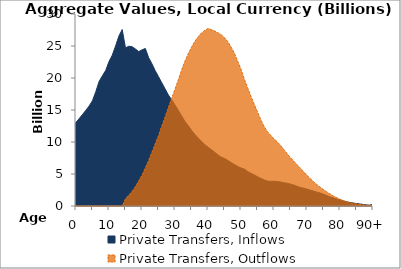
| Category | Private Transfers, Inflows | Private Transfers, Outflows |
|---|---|---|
| 0 | 13060.949 | 0 |
|  | 13683.931 | 0 |
| 2 | 14319.174 | 0 |
| 3 | 14969.134 | 0 |
| 4 | 15635.68 | 0 |
| 5 | 16471.682 | 0 |
| 6 | 17861.365 | 0 |
| 7 | 19458.074 | 0 |
| 8 | 20355.669 | 0 |
| 9 | 21187.214 | 0 |
| 10 | 22567.066 | 0 |
| 11 | 23577.387 | 0 |
| 12 | 25017.624 | 0 |
| 13 | 26551.869 | 0 |
| 14 | 27567.017 | 0 |
| 15 | 24698.951 | 1110.906 |
| 16 | 24968.964 | 1677.984 |
| 17 | 24888.301 | 2272.665 |
| 18 | 24539.185 | 3008.061 |
| 19 | 24130.354 | 3904.208 |
| 20 | 24391.892 | 4809.253 |
| 21 | 24617.136 | 5937.234 |
| 22 | 23202.433 | 7082.134 |
| 23 | 22231.454 | 8383.994 |
| 24 | 21148.597 | 9679.984 |
| 25 | 20210.126 | 10975.933 |
| 26 | 19248.991 | 12488.269 |
| 27 | 18295.914 | 13891.81 |
| 28 | 17345.212 | 15371.939 |
| 29 | 16586.668 | 16845.138 |
| 30 | 15787.83 | 18237.789 |
| 31 | 14945.461 | 19702.668 |
| 32 | 14089.258 | 21246.434 |
| 33 | 13225.375 | 22619.112 |
| 34 | 12552.589 | 23770.285 |
| 35 | 11824.703 | 24812.503 |
| 36 | 11193.01 | 25707.191 |
| 37 | 10645.008 | 26432.095 |
| 38 | 10110.503 | 27028.525 |
| 39 | 9610.866 | 27434.552 |
| 40 | 9187.967 | 27735.307 |
| 41 | 8817.423 | 27564.939 |
| 42 | 8411.336 | 27361.245 |
| 43 | 7995.123 | 27066.611 |
| 44 | 7641.085 | 26770.458 |
| 45 | 7432.326 | 26305.61 |
| 46 | 7118.133 | 25690.476 |
| 47 | 6783.356 | 24835.31 |
| 48 | 6475.558 | 23879.21 |
| 49 | 6186.37 | 22625.973 |
| 50 | 5931.722 | 21389.229 |
| 51 | 5772.176 | 19839.645 |
| 52 | 5388.957 | 18503.13 |
| 53 | 5110.35 | 17166.266 |
| 54 | 4864.335 | 15918.294 |
| 55 | 4573.478 | 14711.662 |
| 56 | 4317.473 | 13481.25 |
| 57 | 4077.794 | 12437.572 |
| 58 | 3902.969 | 11622.822 |
| 59 | 3853.429 | 11045.266 |
| 60 | 3867.9 | 10497.277 |
| 61 | 3826.139 | 10024.271 |
| 62 | 3740.489 | 9451.791 |
| 63 | 3628.864 | 8825.379 |
| 64 | 3547.42 | 8172.95 |
| 65 | 3412.526 | 7553.098 |
| 66 | 3277.087 | 7011.615 |
| 67 | 3076.686 | 6443.188 |
| 68 | 2898.02 | 5903.912 |
| 69 | 2771.711 | 5338.334 |
| 70 | 2624.419 | 4802.445 |
| 71 | 2471.839 | 4283.998 |
| 72 | 2333.384 | 3802.095 |
| 73 | 2166.149 | 3341.467 |
| 74 | 2028.64 | 2943.429 |
| 75 | 1845.484 | 2570.06 |
| 76 | 1631.64 | 2203.656 |
| 77 | 1425.229 | 1882.023 |
| 78 | 1267.911 | 1573.135 |
| 79 | 1088.247 | 1310.707 |
| 80 | 943.586 | 1061.457 |
| 81 | 787.809 | 847.726 |
| 82 | 658.494 | 666.042 |
| 83 | 557.115 | 524.15 |
| 84 | 469.02 | 413.389 |
| 85 | 383.86 | 317.865 |
| 86 | 320.783 | 238.093 |
| 87 | 230.351 | 174.385 |
| 88 | 174.341 | 125.658 |
| 89 | 129.447 | 88.559 |
| 90+ | 290.576 | 188.048 |